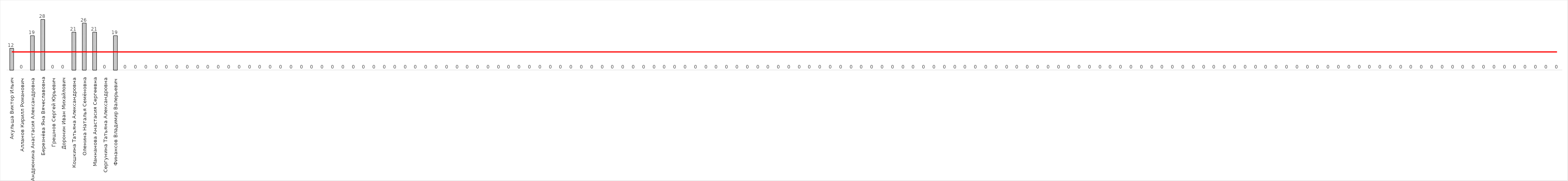
| Category | Series 0 |
|---|---|
| Акульша Виктор Ильич | 12 |
| Алланов Кирилл Романович | 0 |
| Андрюнина Анастасия Александровна | 19 |
| Березнёва Яна Вячеславовна | 28 |
| Грешнов Сергей Юрьевич | 0 |
| Доронин Иван Михайлович | 0 |
| Кошкина Татьяна Александровна | 21 |
| Оленина Наталья Семёновна | 26 |
| Маннанова Анастасия Сергеевна | 21 |
| Сергунина Татьяна Александровна | 0 |
| Финансов Владимир Валерьевич | 19 |